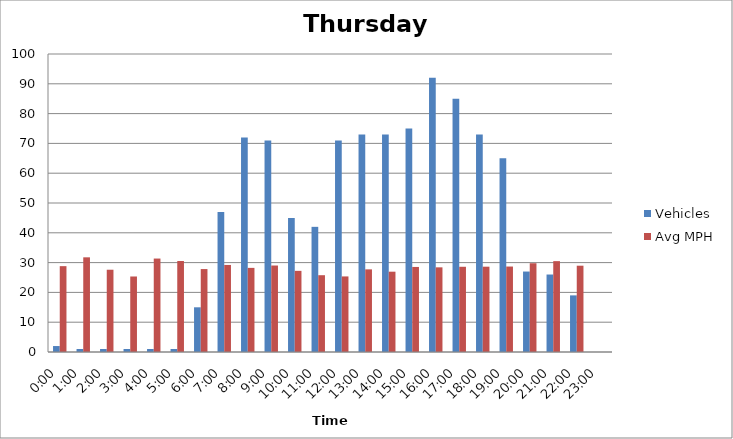
| Category | Vehicles | Avg MPH |
|---|---|---|
| 0:00 | 2 | 28.81 |
| 1:00 | 1 | 31.77 |
| 2:00 | 1 | 27.61 |
| 3:00 | 1 | 25.34 |
| 4:00 | 1 | 31.36 |
| 5:00 | 1 | 30.53 |
| 6:00 | 15 | 27.83 |
| 7:00 | 47 | 29.21 |
| 8:00 | 72 | 28.23 |
| 9:00 | 71 | 29.02 |
| 10:00 | 45 | 27.23 |
| 11:00 | 42 | 25.77 |
| 12:00 | 71 | 25.36 |
| 13:00 | 73 | 27.73 |
| 14:00 | 73 | 26.95 |
| 15:00 | 75 | 28.54 |
| 16:00 | 92 | 28.41 |
| 17:00 | 85 | 28.6 |
| 18:00 | 73 | 28.63 |
| 19:00 | 65 | 28.68 |
| 20:00 | 27 | 29.79 |
| 21:00 | 26 | 30.49 |
| 22:00 | 19 | 28.96 |
| 23:00 | 0 | 0 |